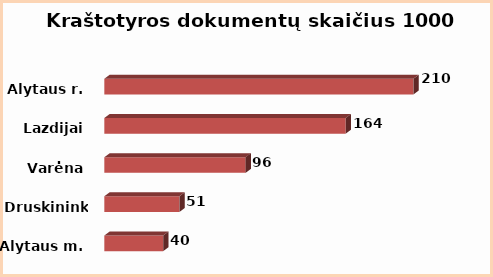
| Category | Series 0 |
|---|---|
| Alytaus m. | 40 |
| Druskininkai | 51 |
| Varėna | 96 |
| Lazdijai | 164 |
| Alytaus r. | 210 |